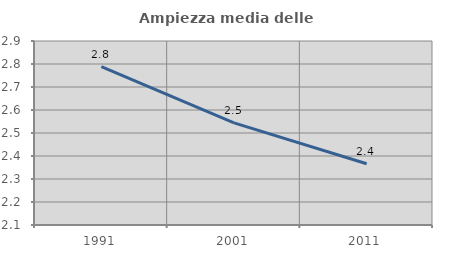
| Category | Ampiezza media delle famiglie |
|---|---|
| 1991.0 | 2.789 |
| 2001.0 | 2.544 |
| 2011.0 | 2.367 |